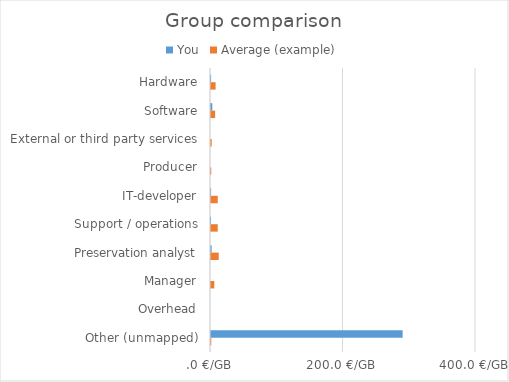
| Category | You | Average (example) |
|---|---|---|
| Hardware | 0.195 | 6.92 |
| Software | 1.953 | 6.26 |
| External or third party services | 0 | 1.06 |
| Producer | 0 | 0.43 |
| IT-developer | 0.137 | 10.19 |
| Support / operations | 0.059 | 10.19 |
| Preservation analyst | 0.977 | 11.66 |
| Manager | 0 | 4.95 |
| Overhead | 0 | 0 |
| Other (unmapped) | 289.258 | 0.43 |